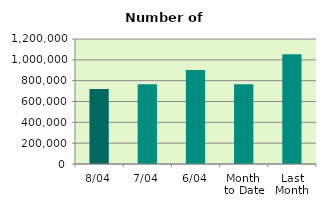
| Category | Series 0 |
|---|---|
| 8/04 | 719208 |
| 7/04 | 766522 |
| 6/04 | 902050 |
| Month 
to Date | 766250.333 |
| Last
Month | 1053589.478 |